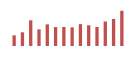
| Category | Importações (2) |
|---|---|
| 0 | 575.605 |
| 1 | 741.035 |
| 2 | 1388.881 |
| 3 | 899.436 |
| 4 | 1170.349 |
| 5 | 1022.737 |
| 6 | 1030.066 |
| 7 | 1010.02 |
| 8 | 1183.202 |
| 9 | 1121.55 |
| 10 | 1027.2 |
| 11 | 1322.664 |
| 12 | 1463.875 |
| 13 | 1904.125 |